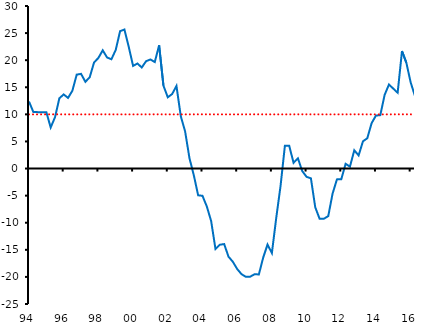
| Category | BIS | Límite CCyB |
|---|---|---|
| 94 | 12.369 | 10 |
| II | 10.447 | 10 |
| III | 10.413 | 10 |
| IV | 10.368 | 10 |
| 95 | 10.406 | 10 |
| II | 7.577 | 10 |
| III | 9.475 | 10 |
| IV | 12.967 | 10 |
| 96 | 13.683 | 10 |
| II | 13.034 | 10 |
| III | 14.362 | 10 |
| IV | 17.336 | 10 |
| 97 | 17.478 | 10 |
| II | 16.01 | 10 |
| III | 16.857 | 10 |
| IV | 19.58 | 10 |
| 98 | 20.416 | 10 |
| II | 21.824 | 10 |
| III | 20.5 | 10 |
| IV | 20.173 | 10 |
| 99 | 21.898 | 10 |
| II | 25.355 | 10 |
| III | 25.658 | 10 |
| IV | 22.448 | 10 |
| 00 | 18.944 | 10 |
| II | 19.387 | 10 |
| III | 18.653 | 10 |
| IV | 19.817 | 10 |
| 01 | 20.134 | 10 |
| II | 19.656 | 10 |
| III | 22.751 | 10 |
| IV | 15.293 | 10 |
| 02 | 13.15 | 10 |
| II | 13.751 | 10 |
| III | 15.24 | 10 |
| IV | 9.656 | 10 |
| 03 | 6.834 | 10 |
| II | 1.907 | 10 |
| III | -1.229 | 10 |
| IV | -4.937 | 10 |
| 04 | -5.032 | 10 |
| II | -7.001 | 10 |
| III | -9.695 | 10 |
| IV | -14.864 | 10 |
| 05 | -14.06 | 10 |
| II | -13.942 | 10 |
| III | -16.264 | 10 |
| IV | -17.206 | 10 |
| 06 | -18.542 | 10 |
| II | -19.494 | 10 |
| III | -19.988 | 10 |
| IV | -19.953 | 10 |
| 07 | -19.513 | 10 |
| II | -19.542 | 10 |
| III | -16.424 | 10 |
| IV | -14.021 | 10 |
| 08 | -15.604 | 10 |
| II | -9.141 | 10 |
| III | -3.21 | 10 |
| IV | 4.193 | 10 |
| 09 | 4.19 | 10 |
| II | 1.063 | 10 |
| III | 1.886 | 10 |
| IV | -0.457 | 10 |
| 10 | -1.537 | 10 |
| II | -1.8 | 10 |
| III | -7.148 | 10 |
| IV | -9.263 | 10 |
| 11 | -9.262 | 10 |
| II | -8.775 | 10 |
| III | -4.615 | 10 |
| IV | -2 | 10 |
| 12 | -1.982 | 10 |
| II | 0.873 | 10 |
| III | 0.357 | 10 |
| IV | 3.366 | 10 |
| 13 | 2.424 | 10 |
| II | 5.028 | 10 |
| III | 5.59 | 10 |
| IV | 8.382 | 10 |
| 14 | 9.78 | 10 |
| II | 9.857 | 10 |
| III | 13.601 | 10 |
| IV | 15.512 | 10 |
| 15 | 14.743 | 10 |
| II | 13.993 | 10 |
| III | 21.676 | 10 |
| IV | 19.546 | 10 |
| 16 | 15.896 | 10 |
| II | 13.367 | 10 |